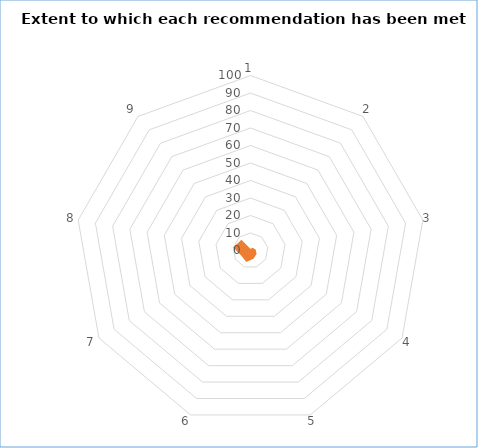
| Category | Series 1 | Series 0 |
|---|---|---|
| 0 | 1 | 0 |
| 1 | 2 | 0 |
| 2 | 3 | 0 |
| 3 | 4 | 0 |
| 4 | 5 | 0 |
| 5 | 7 | 0 |
| 6 | 6 | 0 |
| 7 | 10 | 0 |
| 8 | 8 | 0 |